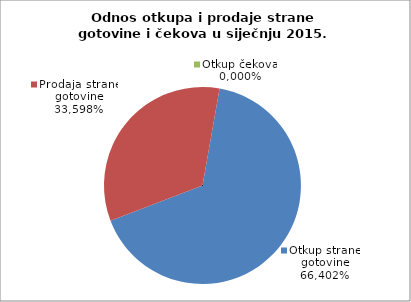
| Category | Otkup strane gotovine | Prodaja strane gotovine | Otkup čekova |
|---|---|---|---|
|  | 0.664 | 0.336 | 0 |